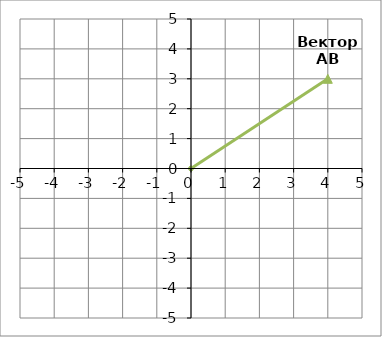
| Category | Вектор АВ |
|---|---|
| 4.0 | 3 |
| 0.0 | 0 |